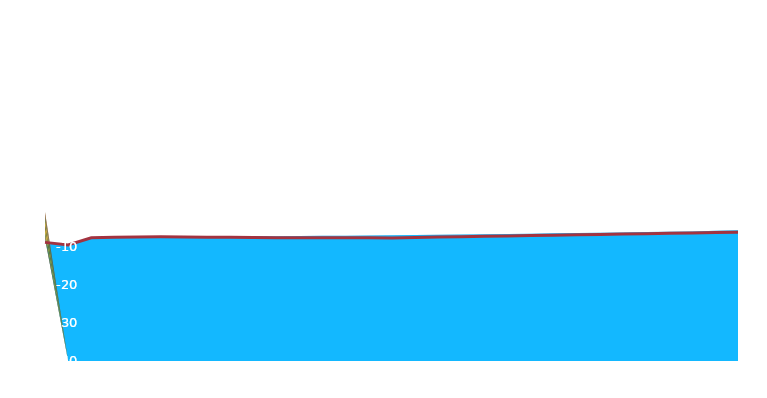
| Category | Russia and Eastern Europe Ref |
|---|---|
| 2020.0 | -8.874 |
| 2021.0 | -9.553 |
| 2022.0 | -7.68 |
| 2023.0 | -7.54 |
| 2024.0 | -7.495 |
| 2025.0 | -7.423 |
| 2026.0 | -7.483 |
| 2027.0 | -7.5 |
| 2028.0 | -7.545 |
| 2029.0 | -7.595 |
| 2030.0 | -7.66 |
| 2031.0 | -7.649 |
| 2032.0 | -7.648 |
| 2033.0 | -7.663 |
| 2034.0 | -7.684 |
| 2035.0 | -7.719 |
| 2036.0 | -7.607 |
| 2037.0 | -7.496 |
| 2038.0 | -7.391 |
| 2039.0 | -7.277 |
| 2040.0 | -7.18 |
| 2041.0 | -7.077 |
| 2042.0 | -6.976 |
| 2043.0 | -6.884 |
| 2044.0 | -6.79 |
| 2045.0 | -6.7 |
| 2046.0 | -6.582 |
| 2047.0 | -6.498 |
| 2048.0 | -6.392 |
| 2049.0 | -6.283 |
| 2050.0 | -6.208 |